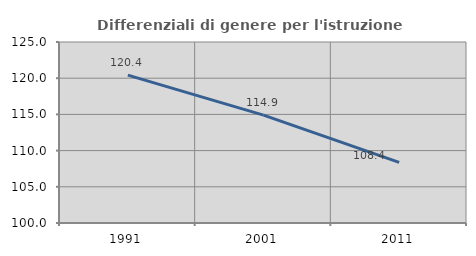
| Category | Differenziali di genere per l'istruzione superiore |
|---|---|
| 1991.0 | 120.427 |
| 2001.0 | 114.904 |
| 2011.0 | 108.377 |